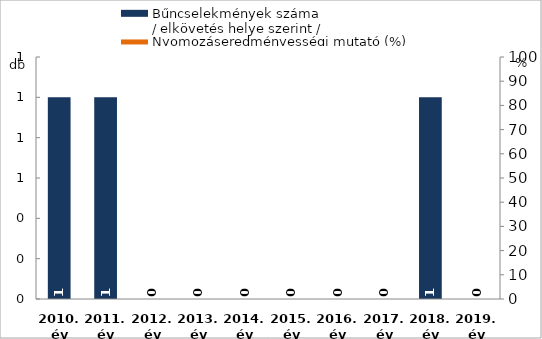
| Category | Bűncselekmények száma
/ elkövetés helye szerint / |
|---|---|
| 2010. év | 1 |
| 2011. év | 1 |
| 2012. év | 0 |
| 2013. év | 0 |
| 2014. év | 0 |
| 2015. év | 0 |
| 2016. év | 0 |
| 2017. év | 0 |
| 2018. év | 1 |
| 2019. év | 0 |